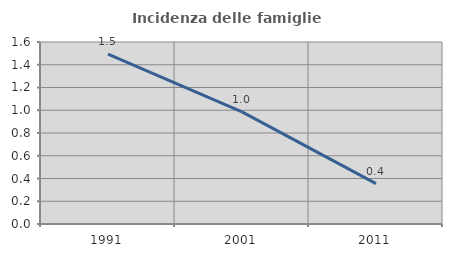
| Category | Incidenza delle famiglie numerose |
|---|---|
| 1991.0 | 1.493 |
| 2001.0 | 0.985 |
| 2011.0 | 0.355 |